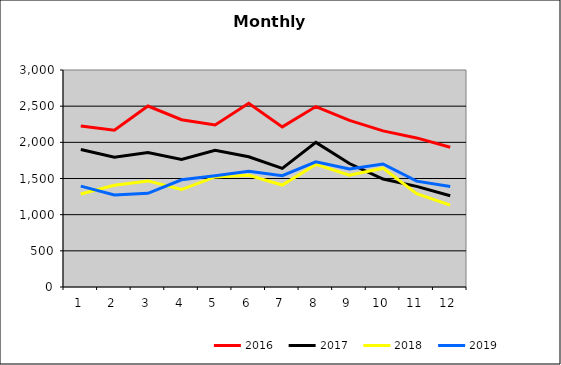
| Category | 2016 | 2017 | 2018 | 2019 |
|---|---|---|---|---|
| 0 | 2226.188 | 1900.859 | 1286.21 | 1394.576 |
| 1 | 2166.497 | 1795.105 | 1406.556 | 1272.617 |
| 2 | 2501.903 | 1859.386 | 1466.695 | 1295.231 |
| 3 | 2312.349 | 1764.013 | 1347.408 | 1482.121 |
| 4 | 2240.561 | 1891.399 | 1522.181 | 1539.379 |
| 5 | 2540.235 | 1800.236 | 1543.945 | 1598.892 |
| 6 | 2213.485 | 1640.121 | 1409.491 | 1538.112 |
| 7 | 2494.361 | 1999.331 | 1694.901 | 1729.426 |
| 8 | 2304.009 | 1706.874 | 1545.104 | 1631.933 |
| 9 | 2158.544 | 1492.036 | 1642.816 | 1701.214 |
| 10 | 2060.966 | 1390.86 | 1288.934 | 1463.951 |
| 11 | 1932.97 | 1261.902 | 1131.485 | 1390.399 |